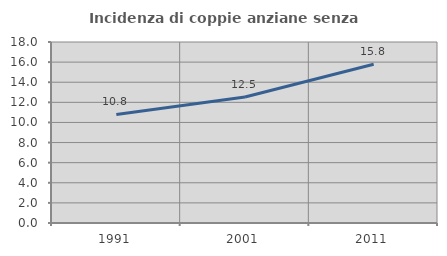
| Category | Incidenza di coppie anziane senza figli  |
|---|---|
| 1991.0 | 10.792 |
| 2001.0 | 12.529 |
| 2011.0 | 15.785 |